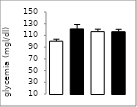
| Category | 3 |
|---|---|
| 0 | 100.143 |
| 1 | 121.143 |
| 2 | 116.5 |
| 3 | 116.357 |